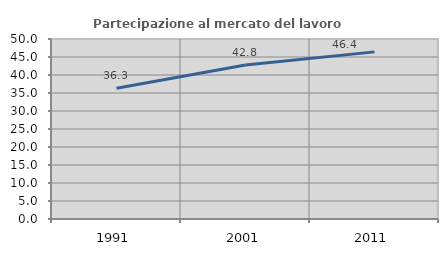
| Category | Partecipazione al mercato del lavoro  femminile |
|---|---|
| 1991.0 | 36.34 |
| 2001.0 | 42.767 |
| 2011.0 | 46.425 |